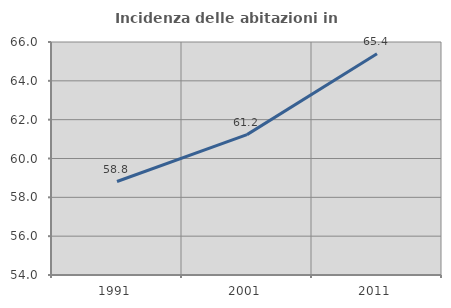
| Category | Incidenza delle abitazioni in proprietà  |
|---|---|
| 1991.0 | 58.815 |
| 2001.0 | 61.229 |
| 2011.0 | 65.391 |